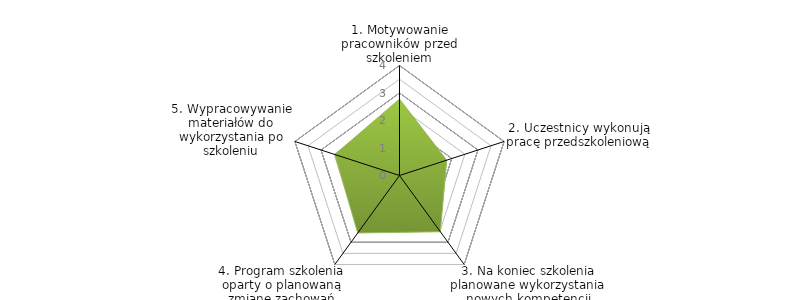
| Category | Series 0 | BENCHMARK |
|---|---|---|
| 1. Motywowanie pracowników przed szkoleniem |  | 2.778 |
| 2. Uczestnicy wykonują pracę przedszkoleniową |  | 1.806 |
| 3. Na koniec szkolenia planowane wykorzystania nowych kompetencji |  | 2.528 |
| 4. Program szkolenia oparty o planowaną zmianę zachowań |  | 2.583 |
| 5. Wypracowywanie materiałów do wykorzystania po szkoleniu |  | 2.472 |